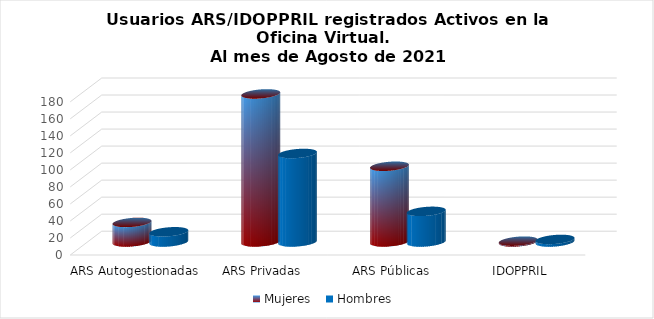
| Category | Mujeres | Hombres |
|---|---|---|
| ARS Autogestionadas | 23 | 12 |
| ARS Privadas | 174 | 104 |
| ARS Públicas | 89 | 36 |
| IDOPPRIL | 1 | 3 |